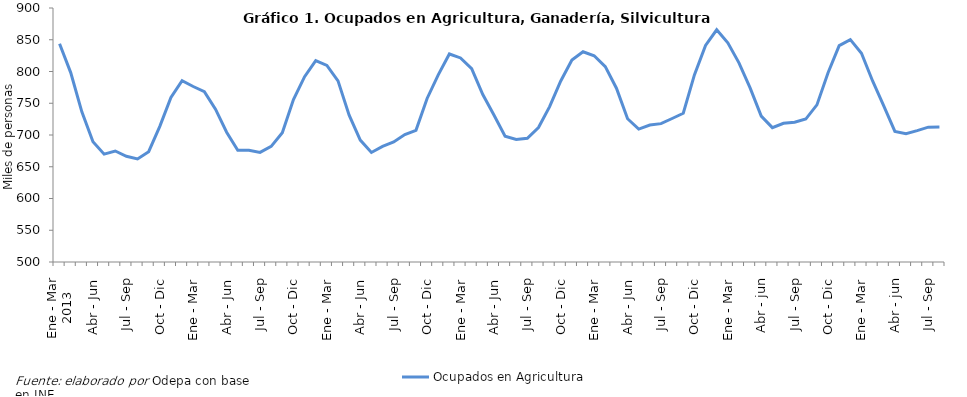
| Category | Ocupados en Agricultura |
|---|---|
| 0 | 843.658 |
| 1 | 798.266 |
| 2 | 736.461 |
| 3 | 689.358 |
| 4 | 669.839 |
| 5 | 674.791 |
| 6 | 666.406 |
| 7 | 662.262 |
| 8 | 673.724 |
| 9 | 713.604 |
| 10 | 758.988 |
| 11 | 785.537 |
| 12 | 776.373 |
| 13 | 768.303 |
| 14 | 740.609 |
| 15 | 704.367 |
| 16 | 675.938 |
| 17 | 676.058 |
| 18 | 672.6 |
| 19 | 682.074 |
| 20 | 703.599 |
| 21 | 755.905 |
| 22 | 791.902 |
| 23 | 817.027 |
| 24 | 809.646 |
| 25 | 785.301 |
| 26 | 731.282 |
| 27 | 691.978 |
| 28 | 672.526 |
| 29 | 682.164 |
| 30 | 689.034 |
| 31 | 700.719 |
| 32 | 707.439 |
| 33 | 757.522 |
| 34 | 794.669 |
| 35 | 827.605 |
| 36 | 821.367 |
| 37 | 804.582 |
| 38 | 763.826 |
| 39 | 731.558 |
| 40 | 698.04 |
| 41 | 692.989 |
| 42 | 694.776 |
| 43 | 711.757 |
| 44 | 744.739 |
| 45 | 785.03 |
| 46 | 818.051 |
| 47 | 831.11 |
| 48 | 824.789 |
| 49 | 807.606 |
| 50 | 773.662 |
| 51 | 725.597 |
| 52 | 709.369 |
| 53 | 715.675 |
| 54 | 717.856 |
| 55 | 725.965 |
| 56 | 734.277 |
| 57 | 794.66 |
| 58 | 841.147 |
| 59 | 865.659 |
| 60 | 845.074 |
| 61 | 813.586 |
| 62 | 774.131 |
| 63 | 729.695 |
| 64 | 711.581 |
| 65 | 718.419 |
| 66 | 720.091 |
| 67 | 725.105 |
| 68 | 747.425 |
| 69 | 798.027 |
| 70 | 840.667 |
| 71 | 850.292 |
| 72 | 828.766 |
| 73 | 785.1 |
| 74 | 745.744 |
| 75 | 705.675 |
| 76 | 702.138 |
| 77 | 706.921 |
| 78 | 712.332 |
| 79 | 712.629 |